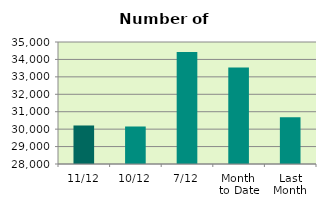
| Category | Series 0 |
|---|---|
| 11/12 | 30210 |
| 10/12 | 30152 |
| 7/12 | 34428 |
| Month 
to Date | 33538 |
| Last
Month | 30687.818 |